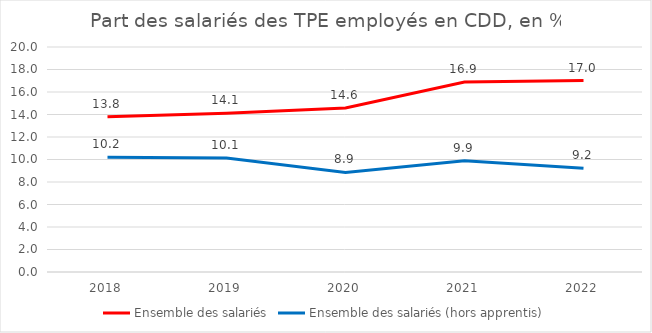
| Category | Ensemble des salariés | Ensemble des salariés (hors apprentis) |
|---|---|---|
| 2018.0 | 13.797 | 10.203 |
| 2019.0 | 14.116 | 10.129 |
| 2020.0 | 14.582 | 8.853 |
| 2021.0 | 16.896 | 9.888 |
| 2022.0 | 17.02 | 9.219 |